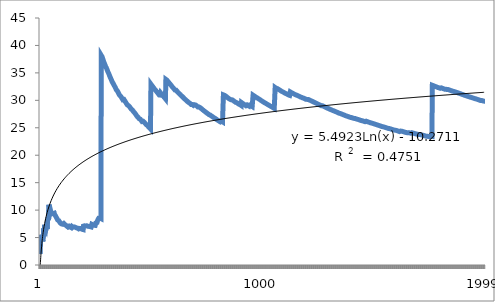
| Category | Series 0 |
|---|---|
| 0 | 2 |
| 1 | 3 |
| 2 | 4.667 |
| 3 | 5.5 |
| 4 | 4.8 |
| 5 | 5.333 |
| 6 | 4.857 |
| 7 | 5.25 |
| 8 | 5.111 |
| 9 | 4.8 |
| 10 | 4.727 |
| 11 | 4.5 |
| 12 | 4.308 |
| 13 | 4.571 |
| 14 | 4.4 |
| 15 | 5.125 |
| 16 | 6.706 |
| 17 | 6.444 |
| 18 | 6.316 |
| 19 | 6.1 |
| 20 | 7.333 |
| 21 | 7.091 |
| 22 | 6.87 |
| 23 | 6.75 |
| 24 | 6.8 |
| 25 | 6.615 |
| 26 | 6.963 |
| 27 | 6.786 |
| 28 | 6.621 |
| 29 | 6.533 |
| 30 | 6.839 |
| 31 | 6.688 |
| 32 | 6.545 |
| 33 | 8.235 |
| 34 | 8.229 |
| 35 | 8.444 |
| 36 | 8.324 |
| 37 | 8.316 |
| 38 | 8.154 |
| 39 | 8.05 |
| 40 | 10.976 |
| 41 | 10.762 |
| 42 | 10.605 |
| 43 | 10.545 |
| 44 | 10.4 |
| 45 | 10.217 |
| 46 | 10.085 |
| 47 | 9.917 |
| 48 | 9.878 |
| 49 | 9.72 |
| 50 | 9.569 |
| 51 | 9.692 |
| 52 | 9.547 |
| 53 | 9.407 |
| 54 | 9.309 |
| 55 | 9.214 |
| 56 | 9.123 |
| 57 | 9.034 |
| 58 | 8.949 |
| 59 | 8.933 |
| 60 | 9.836 |
| 61 | 9.71 |
| 62 | 9.587 |
| 63 | 9.469 |
| 64 | 9.354 |
| 65 | 9.242 |
| 66 | 9.134 |
| 67 | 9.118 |
| 68 | 9.043 |
| 69 | 8.971 |
| 70 | 8.901 |
| 71 | 8.806 |
| 72 | 8.74 |
| 73 | 8.649 |
| 74 | 8.56 |
| 75 | 8.5 |
| 76 | 8.442 |
| 77 | 8.359 |
| 78 | 8.278 |
| 79 | 8.2 |
| 80 | 8.198 |
| 81 | 8.195 |
| 82 | 8.12 |
| 83 | 8.071 |
| 84 | 8.071 |
| 85 | 8 |
| 86 | 7.931 |
| 87 | 7.864 |
| 88 | 7.82 |
| 89 | 7.756 |
| 90 | 7.692 |
| 91 | 7.63 |
| 92 | 7.634 |
| 93 | 7.574 |
| 94 | 7.537 |
| 95 | 7.479 |
| 96 | 7.485 |
| 97 | 7.449 |
| 98 | 7.394 |
| 99 | 7.34 |
| 100 | 7.426 |
| 101 | 7.431 |
| 102 | 7.437 |
| 103 | 7.385 |
| 104 | 7.333 |
| 105 | 7.34 |
| 106 | 7.57 |
| 107 | 7.519 |
| 108 | 7.468 |
| 109 | 7.418 |
| 110 | 7.387 |
| 111 | 7.393 |
| 112 | 7.363 |
| 113 | 7.333 |
| 114 | 7.287 |
| 115 | 7.259 |
| 116 | 7.231 |
| 117 | 7.186 |
| 118 | 7.143 |
| 119 | 7.117 |
| 120 | 7.074 |
| 121 | 7.082 |
| 122 | 7.041 |
| 123 | 7 |
| 124 | 6.96 |
| 125 | 6.921 |
| 126 | 6.898 |
| 127 | 7.094 |
| 128 | 7.101 |
| 129 | 7.062 |
| 130 | 7.069 |
| 131 | 7.03 |
| 132 | 7.038 |
| 133 | 7 |
| 134 | 6.963 |
| 135 | 6.926 |
| 136 | 6.891 |
| 137 | 6.87 |
| 138 | 6.878 |
| 139 | 6.843 |
| 140 | 6.809 |
| 141 | 6.986 |
| 142 | 6.965 |
| 143 | 7.028 |
| 144 | 6.993 |
| 145 | 6.973 |
| 146 | 6.939 |
| 147 | 6.919 |
| 148 | 6.886 |
| 149 | 6.853 |
| 150 | 6.834 |
| 151 | 6.803 |
| 152 | 6.771 |
| 153 | 6.935 |
| 154 | 6.942 |
| 155 | 6.923 |
| 156 | 6.892 |
| 157 | 6.861 |
| 158 | 6.868 |
| 159 | 6.838 |
| 160 | 6.807 |
| 161 | 6.79 |
| 162 | 6.761 |
| 163 | 6.768 |
| 164 | 6.776 |
| 165 | 6.747 |
| 166 | 6.719 |
| 167 | 6.702 |
| 168 | 6.71 |
| 169 | 6.682 |
| 170 | 6.655 |
| 171 | 6.628 |
| 172 | 6.601 |
| 173 | 6.575 |
| 174 | 6.549 |
| 175 | 6.523 |
| 176 | 6.531 |
| 177 | 6.674 |
| 178 | 6.659 |
| 179 | 6.633 |
| 180 | 6.608 |
| 181 | 6.659 |
| 182 | 6.645 |
| 183 | 6.62 |
| 184 | 6.595 |
| 185 | 6.57 |
| 186 | 6.545 |
| 187 | 6.532 |
| 188 | 6.508 |
| 189 | 6.484 |
| 190 | 6.461 |
| 191 | 6.469 |
| 192 | 6.477 |
| 193 | 6.454 |
| 194 | 7.077 |
| 195 | 7.051 |
| 196 | 7.025 |
| 197 | 7.152 |
| 198 | 7.136 |
| 199 | 7.14 |
| 200 | 7.144 |
| 201 | 7.119 |
| 202 | 7.094 |
| 203 | 7.069 |
| 204 | 7.112 |
| 205 | 7.087 |
| 206 | 7.063 |
| 207 | 7.048 |
| 208 | 7.024 |
| 209 | 7.143 |
| 210 | 7.128 |
| 211 | 7.104 |
| 212 | 7.08 |
| 213 | 7.056 |
| 214 | 7.06 |
| 215 | 7.046 |
| 216 | 7.051 |
| 217 | 7.037 |
| 218 | 7.023 |
| 219 | 7.027 |
| 220 | 7.014 |
| 221 | 6.991 |
| 222 | 7.031 |
| 223 | 7.018 |
| 224 | 6.996 |
| 225 | 6.982 |
| 226 | 6.96 |
| 227 | 6.947 |
| 228 | 6.952 |
| 229 | 6.939 |
| 230 | 6.918 |
| 231 | 6.897 |
| 232 | 7.416 |
| 233 | 7.393 |
| 234 | 7.379 |
| 235 | 7.356 |
| 236 | 7.342 |
| 237 | 7.319 |
| 238 | 7.305 |
| 239 | 7.283 |
| 240 | 7.261 |
| 241 | 7.248 |
| 242 | 7.235 |
| 243 | 7.221 |
| 244 | 7.208 |
| 245 | 7.244 |
| 246 | 7.223 |
| 247 | 7.21 |
| 248 | 7.197 |
| 249 | 7.176 |
| 250 | 7.657 |
| 251 | 7.635 |
| 252 | 7.668 |
| 253 | 7.646 |
| 254 | 7.631 |
| 255 | 7.727 |
| 256 | 7.704 |
| 257 | 7.69 |
| 258 | 8.154 |
| 259 | 8.246 |
| 260 | 8.222 |
| 261 | 8.221 |
| 262 | 8.312 |
| 263 | 8.523 |
| 264 | 8.506 |
| 265 | 8.594 |
| 266 | 8.569 |
| 267 | 8.567 |
| 268 | 8.543 |
| 269 | 8.519 |
| 270 | 8.494 |
| 271 | 8.493 |
| 272 | 8.469 |
| 273 | 8.445 |
| 274 | 38.204 |
| 275 | 38.094 |
| 276 | 38.188 |
| 277 | 38.065 |
| 278 | 37.935 |
| 279 | 37.807 |
| 280 | 37.68 |
| 281 | 37.553 |
| 282 | 37.428 |
| 283 | 37.303 |
| 284 | 37.179 |
| 285 | 37.077 |
| 286 | 36.955 |
| 287 | 36.854 |
| 288 | 36.754 |
| 289 | 36.683 |
| 290 | 36.57 |
| 291 | 36.452 |
| 292 | 36.355 |
| 293 | 36.259 |
| 294 | 36.142 |
| 295 | 36.027 |
| 296 | 36.013 |
| 297 | 35.919 |
| 298 | 35.853 |
| 299 | 35.74 |
| 300 | 35.628 |
| 301 | 35.517 |
| 302 | 35.406 |
| 303 | 35.303 |
| 304 | 35.193 |
| 305 | 35.131 |
| 306 | 35.068 |
| 307 | 34.961 |
| 308 | 34.861 |
| 309 | 34.755 |
| 310 | 34.656 |
| 311 | 34.551 |
| 312 | 34.447 |
| 313 | 34.344 |
| 314 | 34.241 |
| 315 | 34.139 |
| 316 | 34.038 |
| 317 | 33.981 |
| 318 | 33.881 |
| 319 | 33.781 |
| 320 | 33.688 |
| 321 | 33.59 |
| 322 | 33.492 |
| 323 | 33.395 |
| 324 | 33.298 |
| 325 | 33.294 |
| 326 | 33.205 |
| 327 | 33.116 |
| 328 | 33.027 |
| 329 | 32.976 |
| 330 | 32.888 |
| 331 | 32.795 |
| 332 | 32.745 |
| 333 | 32.653 |
| 334 | 32.603 |
| 335 | 32.518 |
| 336 | 32.433 |
| 337 | 32.349 |
| 338 | 32.26 |
| 339 | 32.171 |
| 340 | 32.082 |
| 341 | 31.994 |
| 342 | 31.913 |
| 343 | 31.843 |
| 344 | 31.762 |
| 345 | 31.855 |
| 346 | 31.769 |
| 347 | 31.69 |
| 348 | 31.61 |
| 349 | 31.526 |
| 350 | 31.447 |
| 351 | 31.364 |
| 352 | 31.28 |
| 353 | 31.198 |
| 354 | 31.115 |
| 355 | 31.034 |
| 356 | 30.969 |
| 357 | 30.888 |
| 358 | 30.808 |
| 359 | 30.9 |
| 360 | 30.825 |
| 361 | 30.746 |
| 362 | 30.672 |
| 363 | 30.599 |
| 364 | 30.603 |
| 365 | 30.525 |
| 366 | 30.463 |
| 367 | 30.391 |
| 368 | 30.314 |
| 369 | 30.254 |
| 370 | 30.178 |
| 371 | 30.102 |
| 372 | 30.027 |
| 373 | 29.957 |
| 374 | 29.963 |
| 375 | 30.223 |
| 376 | 30.154 |
| 377 | 30.085 |
| 378 | 30.016 |
| 379 | 29.958 |
| 380 | 29.9 |
| 381 | 29.827 |
| 382 | 29.755 |
| 383 | 29.688 |
| 384 | 29.631 |
| 385 | 29.56 |
| 386 | 29.504 |
| 387 | 29.433 |
| 388 | 29.368 |
| 389 | 29.313 |
| 390 | 29.243 |
| 391 | 29.179 |
| 392 | 29.109 |
| 393 | 29.076 |
| 394 | 29.023 |
| 395 | 29.111 |
| 396 | 29.043 |
| 397 | 29.01 |
| 398 | 28.942 |
| 399 | 28.95 |
| 400 | 28.898 |
| 401 | 28.831 |
| 402 | 28.799 |
| 403 | 28.738 |
| 404 | 28.677 |
| 405 | 28.611 |
| 406 | 28.545 |
| 407 | 28.485 |
| 408 | 28.455 |
| 409 | 28.39 |
| 410 | 28.399 |
| 411 | 28.34 |
| 412 | 28.281 |
| 413 | 28.29 |
| 414 | 28.231 |
| 415 | 28.173 |
| 416 | 28.11 |
| 417 | 28.053 |
| 418 | 27.995 |
| 419 | 27.967 |
| 420 | 27.938 |
| 421 | 27.891 |
| 422 | 27.83 |
| 423 | 27.774 |
| 424 | 27.713 |
| 425 | 27.667 |
| 426 | 27.607 |
| 427 | 27.547 |
| 428 | 27.487 |
| 429 | 27.428 |
| 430 | 27.369 |
| 431 | 27.315 |
| 432 | 27.256 |
| 433 | 27.198 |
| 434 | 27.14 |
| 435 | 27.083 |
| 436 | 27.094 |
| 437 | 27.037 |
| 438 | 26.984 |
| 439 | 26.927 |
| 440 | 26.875 |
| 441 | 26.824 |
| 442 | 26.767 |
| 443 | 26.712 |
| 444 | 26.661 |
| 445 | 26.637 |
| 446 | 26.649 |
| 447 | 26.607 |
| 448 | 26.619 |
| 449 | 26.564 |
| 450 | 26.514 |
| 451 | 26.46 |
| 452 | 26.406 |
| 453 | 26.352 |
| 454 | 26.299 |
| 455 | 26.246 |
| 456 | 26.193 |
| 457 | 26.14 |
| 458 | 26.087 |
| 459 | 26.035 |
| 460 | 26.013 |
| 461 | 25.965 |
| 462 | 26.186 |
| 463 | 26.138 |
| 464 | 26.151 |
| 465 | 26.112 |
| 466 | 26.06 |
| 467 | 26.009 |
| 468 | 25.957 |
| 469 | 25.911 |
| 470 | 25.864 |
| 471 | 25.814 |
| 472 | 25.763 |
| 473 | 25.717 |
| 474 | 25.68 |
| 475 | 25.634 |
| 476 | 25.585 |
| 477 | 25.536 |
| 478 | 25.549 |
| 479 | 25.504 |
| 480 | 25.459 |
| 481 | 25.415 |
| 482 | 25.371 |
| 483 | 25.322 |
| 484 | 25.274 |
| 485 | 25.23 |
| 486 | 25.187 |
| 487 | 25.139 |
| 488 | 25.104 |
| 489 | 25.057 |
| 490 | 25.01 |
| 491 | 24.963 |
| 492 | 24.917 |
| 493 | 24.874 |
| 494 | 24.828 |
| 495 | 24.794 |
| 496 | 24.761 |
| 497 | 32.936 |
| 498 | 32.878 |
| 499 | 32.828 |
| 500 | 32.77 |
| 501 | 32.713 |
| 502 | 32.664 |
| 503 | 32.603 |
| 504 | 32.554 |
| 505 | 32.498 |
| 506 | 32.45 |
| 507 | 32.394 |
| 508 | 32.334 |
| 509 | 32.278 |
| 510 | 32.219 |
| 511 | 32.16 |
| 512 | 32.101 |
| 513 | 32.043 |
| 514 | 31.988 |
| 515 | 31.988 |
| 516 | 31.93 |
| 517 | 31.873 |
| 518 | 31.842 |
| 519 | 31.785 |
| 520 | 31.727 |
| 521 | 31.67 |
| 522 | 31.618 |
| 523 | 31.561 |
| 524 | 31.516 |
| 525 | 31.464 |
| 526 | 31.412 |
| 527 | 31.356 |
| 528 | 31.304 |
| 529 | 31.249 |
| 530 | 31.198 |
| 531 | 31.143 |
| 532 | 31.088 |
| 533 | 31.034 |
| 534 | 30.979 |
| 535 | 30.937 |
| 536 | 31.117 |
| 537 | 31.063 |
| 538 | 31.009 |
| 539 | 30.956 |
| 540 | 30.902 |
| 541 | 31.317 |
| 542 | 31.263 |
| 543 | 31.21 |
| 544 | 31.167 |
| 545 | 31.114 |
| 546 | 31.06 |
| 547 | 31.033 |
| 548 | 30.98 |
| 549 | 30.938 |
| 550 | 30.886 |
| 551 | 30.833 |
| 552 | 30.785 |
| 553 | 30.733 |
| 554 | 30.681 |
| 555 | 30.629 |
| 556 | 30.578 |
| 557 | 30.538 |
| 558 | 30.49 |
| 559 | 30.439 |
| 560 | 30.389 |
| 561 | 30.338 |
| 562 | 30.288 |
| 563 | 30.238 |
| 564 | 33.809 |
| 565 | 33.756 |
| 566 | 33.81 |
| 567 | 33.764 |
| 568 | 33.712 |
| 569 | 33.66 |
| 570 | 33.604 |
| 571 | 33.552 |
| 572 | 33.501 |
| 573 | 33.446 |
| 574 | 33.391 |
| 575 | 33.34 |
| 576 | 33.286 |
| 577 | 33.256 |
| 578 | 33.206 |
| 579 | 33.162 |
| 580 | 33.108 |
| 581 | 33.055 |
| 582 | 33.002 |
| 583 | 32.952 |
| 584 | 32.909 |
| 585 | 32.857 |
| 586 | 32.804 |
| 587 | 32.752 |
| 588 | 32.699 |
| 589 | 32.651 |
| 590 | 32.599 |
| 591 | 32.547 |
| 592 | 32.496 |
| 593 | 32.444 |
| 594 | 32.393 |
| 595 | 32.352 |
| 596 | 32.302 |
| 597 | 32.254 |
| 598 | 32.207 |
| 599 | 32.16 |
| 600 | 32.11 |
| 601 | 32.063 |
| 602 | 32.013 |
| 603 | 31.967 |
| 604 | 31.917 |
| 605 | 31.868 |
| 606 | 31.822 |
| 607 | 31.773 |
| 608 | 31.727 |
| 609 | 31.689 |
| 610 | 31.846 |
| 611 | 31.797 |
| 612 | 31.749 |
| 613 | 31.7 |
| 614 | 31.652 |
| 615 | 31.607 |
| 616 | 31.569 |
| 617 | 31.521 |
| 618 | 31.473 |
| 619 | 31.426 |
| 620 | 31.382 |
| 621 | 31.357 |
| 622 | 31.31 |
| 623 | 31.272 |
| 624 | 31.229 |
| 625 | 31.185 |
| 626 | 31.148 |
| 627 | 31.105 |
| 628 | 31.059 |
| 629 | 31.035 |
| 630 | 30.989 |
| 631 | 30.943 |
| 632 | 30.897 |
| 633 | 30.852 |
| 634 | 30.854 |
| 635 | 30.808 |
| 636 | 30.763 |
| 637 | 30.718 |
| 638 | 30.682 |
| 639 | 30.641 |
| 640 | 30.599 |
| 641 | 30.555 |
| 642 | 30.513 |
| 643 | 30.469 |
| 644 | 30.425 |
| 645 | 30.381 |
| 646 | 30.34 |
| 647 | 30.299 |
| 648 | 30.256 |
| 649 | 30.215 |
| 650 | 30.172 |
| 651 | 30.175 |
| 652 | 30.141 |
| 653 | 30.098 |
| 654 | 30.055 |
| 655 | 30.021 |
| 656 | 29.982 |
| 657 | 29.942 |
| 658 | 29.9 |
| 659 | 29.867 |
| 660 | 29.825 |
| 661 | 29.782 |
| 662 | 29.75 |
| 663 | 29.711 |
| 664 | 29.672 |
| 665 | 29.64 |
| 666 | 29.643 |
| 667 | 29.602 |
| 668 | 29.561 |
| 669 | 29.528 |
| 670 | 29.508 |
| 671 | 29.488 |
| 672 | 29.456 |
| 673 | 29.424 |
| 674 | 29.384 |
| 675 | 29.343 |
| 676 | 29.312 |
| 677 | 29.271 |
| 678 | 29.231 |
| 679 | 29.191 |
| 680 | 29.154 |
| 681 | 29.299 |
| 682 | 29.268 |
| 683 | 29.231 |
| 684 | 29.2 |
| 685 | 29.163 |
| 686 | 29.144 |
| 687 | 29.108 |
| 688 | 29.068 |
| 689 | 29.049 |
| 690 | 29.013 |
| 691 | 29.064 |
| 692 | 29.206 |
| 693 | 29.187 |
| 694 | 29.148 |
| 695 | 29.152 |
| 696 | 29.116 |
| 697 | 29.077 |
| 698 | 29.127 |
| 699 | 29.097 |
| 700 | 29.058 |
| 701 | 29.04 |
| 702 | 29.004 |
| 703 | 28.974 |
| 704 | 28.936 |
| 705 | 28.898 |
| 706 | 28.86 |
| 707 | 28.822 |
| 708 | 28.784 |
| 709 | 28.924 |
| 710 | 28.886 |
| 711 | 28.848 |
| 712 | 28.811 |
| 713 | 28.776 |
| 714 | 28.738 |
| 715 | 28.709 |
| 716 | 28.672 |
| 717 | 28.643 |
| 718 | 28.648 |
| 719 | 28.619 |
| 720 | 28.602 |
| 721 | 28.565 |
| 722 | 28.528 |
| 723 | 28.494 |
| 724 | 28.458 |
| 725 | 28.421 |
| 726 | 28.385 |
| 727 | 28.349 |
| 728 | 28.321 |
| 729 | 28.285 |
| 730 | 28.252 |
| 731 | 28.216 |
| 732 | 28.188 |
| 733 | 28.155 |
| 734 | 28.12 |
| 735 | 28.084 |
| 736 | 28.057 |
| 737 | 28.024 |
| 738 | 27.989 |
| 739 | 27.954 |
| 740 | 27.927 |
| 741 | 27.911 |
| 742 | 27.876 |
| 743 | 27.844 |
| 744 | 27.812 |
| 745 | 27.786 |
| 746 | 27.751 |
| 747 | 27.717 |
| 748 | 27.682 |
| 749 | 27.651 |
| 750 | 27.625 |
| 751 | 27.598 |
| 752 | 27.572 |
| 753 | 27.541 |
| 754 | 27.507 |
| 755 | 27.474 |
| 756 | 27.443 |
| 757 | 27.409 |
| 758 | 27.375 |
| 759 | 27.345 |
| 760 | 27.319 |
| 761 | 27.286 |
| 762 | 27.261 |
| 763 | 27.309 |
| 764 | 27.278 |
| 765 | 27.248 |
| 766 | 27.218 |
| 767 | 27.185 |
| 768 | 27.152 |
| 769 | 27.119 |
| 770 | 27.105 |
| 771 | 27.073 |
| 772 | 27.058 |
| 773 | 27.026 |
| 774 | 26.996 |
| 775 | 26.966 |
| 776 | 26.934 |
| 777 | 26.902 |
| 778 | 26.87 |
| 779 | 26.856 |
| 780 | 26.825 |
| 781 | 26.795 |
| 782 | 26.782 |
| 783 | 26.75 |
| 784 | 26.736 |
| 785 | 26.705 |
| 786 | 26.673 |
| 787 | 26.645 |
| 788 | 26.616 |
| 789 | 26.585 |
| 790 | 26.554 |
| 791 | 26.523 |
| 792 | 26.494 |
| 793 | 26.463 |
| 794 | 26.47 |
| 795 | 26.442 |
| 796 | 26.412 |
| 797 | 26.383 |
| 798 | 26.353 |
| 799 | 26.322 |
| 800 | 26.292 |
| 801 | 26.269 |
| 802 | 26.239 |
| 803 | 26.209 |
| 804 | 26.196 |
| 805 | 26.166 |
| 806 | 26.139 |
| 807 | 26.111 |
| 808 | 26.082 |
| 809 | 26.052 |
| 810 | 26.022 |
| 811 | 25.993 |
| 812 | 25.963 |
| 813 | 26.246 |
| 814 | 26.218 |
| 815 | 26.189 |
| 816 | 26.162 |
| 817 | 26.132 |
| 818 | 26.11 |
| 819 | 26.08 |
| 820 | 26.058 |
| 821 | 26.046 |
| 822 | 30.991 |
| 823 | 31.032 |
| 824 | 30.996 |
| 825 | 30.961 |
| 826 | 30.943 |
| 827 | 30.911 |
| 828 | 30.883 |
| 829 | 30.848 |
| 830 | 30.813 |
| 831 | 30.815 |
| 832 | 30.78 |
| 833 | 30.746 |
| 834 | 30.719 |
| 835 | 30.687 |
| 836 | 30.652 |
| 837 | 30.621 |
| 838 | 30.586 |
| 839 | 30.555 |
| 840 | 30.523 |
| 841 | 30.489 |
| 842 | 30.456 |
| 843 | 30.429 |
| 844 | 30.398 |
| 845 | 30.364 |
| 846 | 30.331 |
| 847 | 30.3 |
| 848 | 30.266 |
| 849 | 30.268 |
| 850 | 30.242 |
| 851 | 30.209 |
| 852 | 30.183 |
| 853 | 30.15 |
| 854 | 30.119 |
| 855 | 30.089 |
| 856 | 30.056 |
| 857 | 30.096 |
| 858 | 30.065 |
| 859 | 30.179 |
| 860 | 30.146 |
| 861 | 30.116 |
| 862 | 30.083 |
| 863 | 30.058 |
| 864 | 30.025 |
| 865 | 29.995 |
| 866 | 29.963 |
| 867 | 29.931 |
| 868 | 29.906 |
| 869 | 29.874 |
| 870 | 29.848 |
| 871 | 29.817 |
| 872 | 29.785 |
| 873 | 29.755 |
| 874 | 29.726 |
| 875 | 29.696 |
| 876 | 29.665 |
| 877 | 29.633 |
| 878 | 29.604 |
| 879 | 29.589 |
| 880 | 29.564 |
| 881 | 29.603 |
| 882 | 29.572 |
| 883 | 29.543 |
| 884 | 29.514 |
| 885 | 29.483 |
| 886 | 29.452 |
| 887 | 29.423 |
| 888 | 29.395 |
| 889 | 29.366 |
| 890 | 29.342 |
| 891 | 29.312 |
| 892 | 29.283 |
| 893 | 29.322 |
| 894 | 29.294 |
| 895 | 29.263 |
| 896 | 29.233 |
| 897 | 29.205 |
| 898 | 29.181 |
| 899 | 29.153 |
| 900 | 29.123 |
| 901 | 29.095 |
| 902 | 29.065 |
| 903 | 29.6 |
| 904 | 29.576 |
| 905 | 29.545 |
| 906 | 29.515 |
| 907 | 29.485 |
| 908 | 29.454 |
| 909 | 29.424 |
| 910 | 29.394 |
| 911 | 29.364 |
| 912 | 29.336 |
| 913 | 29.306 |
| 914 | 29.283 |
| 915 | 29.253 |
| 916 | 29.226 |
| 917 | 29.196 |
| 918 | 29.166 |
| 919 | 29.139 |
| 920 | 29.11 |
| 921 | 29.08 |
| 922 | 29.051 |
| 923 | 29.024 |
| 924 | 28.995 |
| 925 | 28.965 |
| 926 | 28.939 |
| 927 | 28.912 |
| 928 | 29.156 |
| 929 | 29.129 |
| 930 | 29.106 |
| 931 | 29.077 |
| 932 | 29.055 |
| 933 | 29.026 |
| 934 | 28.999 |
| 935 | 28.972 |
| 936 | 28.943 |
| 937 | 28.917 |
| 938 | 28.92 |
| 939 | 28.894 |
| 940 | 28.865 |
| 941 | 29.106 |
| 942 | 29.08 |
| 943 | 29.053 |
| 944 | 29.024 |
| 945 | 28.996 |
| 946 | 29.033 |
| 947 | 29.004 |
| 948 | 28.976 |
| 949 | 28.947 |
| 950 | 28.919 |
| 951 | 28.893 |
| 952 | 28.867 |
| 953 | 28.841 |
| 954 | 28.819 |
| 955 | 30.931 |
| 956 | 30.901 |
| 957 | 30.873 |
| 958 | 30.843 |
| 959 | 30.812 |
| 960 | 30.797 |
| 961 | 30.769 |
| 962 | 30.739 |
| 963 | 30.71 |
| 964 | 30.694 |
| 965 | 30.665 |
| 966 | 30.635 |
| 967 | 30.607 |
| 968 | 30.578 |
| 969 | 30.548 |
| 970 | 30.519 |
| 971 | 30.504 |
| 972 | 30.481 |
| 973 | 30.458 |
| 974 | 30.435 |
| 975 | 30.406 |
| 976 | 30.379 |
| 977 | 30.352 |
| 978 | 30.323 |
| 979 | 30.294 |
| 980 | 30.271 |
| 981 | 30.244 |
| 982 | 30.216 |
| 983 | 30.187 |
| 984 | 30.173 |
| 985 | 30.144 |
| 986 | 30.116 |
| 987 | 30.087 |
| 988 | 30.059 |
| 989 | 30.03 |
| 990 | 30.004 |
| 991 | 29.978 |
| 992 | 29.95 |
| 993 | 29.922 |
| 994 | 29.895 |
| 995 | 29.867 |
| 996 | 29.84 |
| 997 | 29.814 |
| 998 | 29.788 |
| 999 | 29.766 |
| 1000 | 29.738 |
| 1001 | 29.711 |
| 1002 | 29.683 |
| 1003 | 29.655 |
| 1004 | 29.628 |
| 1005 | 29.6 |
| 1006 | 29.587 |
| 1007 | 29.562 |
| 1008 | 29.536 |
| 1009 | 29.509 |
| 1010 | 29.496 |
| 1011 | 29.468 |
| 1012 | 29.441 |
| 1013 | 29.416 |
| 1014 | 29.389 |
| 1015 | 29.362 |
| 1016 | 29.335 |
| 1017 | 29.314 |
| 1018 | 29.288 |
| 1019 | 29.275 |
| 1020 | 29.248 |
| 1021 | 29.221 |
| 1022 | 29.195 |
| 1023 | 29.182 |
| 1024 | 29.155 |
| 1025 | 29.129 |
| 1026 | 29.102 |
| 1027 | 29.076 |
| 1028 | 29.05 |
| 1029 | 29.037 |
| 1030 | 29.013 |
| 1031 | 28.986 |
| 1032 | 28.966 |
| 1033 | 28.94 |
| 1034 | 28.914 |
| 1035 | 28.89 |
| 1036 | 28.866 |
| 1037 | 28.84 |
| 1038 | 28.828 |
| 1039 | 28.802 |
| 1040 | 28.782 |
| 1041 | 28.756 |
| 1042 | 28.733 |
| 1043 | 28.707 |
| 1044 | 28.683 |
| 1045 | 28.66 |
| 1046 | 28.634 |
| 1047 | 28.609 |
| 1048 | 28.583 |
| 1049 | 28.558 |
| 1050 | 28.539 |
| 1051 | 28.519 |
| 1052 | 28.5 |
| 1053 | 28.48 |
| 1054 | 32.336 |
| 1055 | 32.307 |
| 1056 | 32.278 |
| 1057 | 32.25 |
| 1058 | 32.223 |
| 1059 | 32.194 |
| 1060 | 32.179 |
| 1061 | 32.151 |
| 1062 | 32.124 |
| 1063 | 32.109 |
| 1064 | 32.139 |
| 1065 | 32.111 |
| 1066 | 32.084 |
| 1067 | 32.056 |
| 1068 | 32.03 |
| 1069 | 32.002 |
| 1070 | 31.987 |
| 1071 | 31.961 |
| 1072 | 31.946 |
| 1073 | 31.918 |
| 1074 | 31.89 |
| 1075 | 31.862 |
| 1076 | 31.835 |
| 1077 | 31.809 |
| 1078 | 31.781 |
| 1079 | 31.754 |
| 1080 | 31.726 |
| 1081 | 31.699 |
| 1082 | 31.671 |
| 1083 | 31.644 |
| 1084 | 31.618 |
| 1085 | 31.597 |
| 1086 | 31.571 |
| 1087 | 31.546 |
| 1088 | 31.546 |
| 1089 | 31.525 |
| 1090 | 31.498 |
| 1091 | 31.476 |
| 1092 | 31.462 |
| 1093 | 31.435 |
| 1094 | 31.408 |
| 1095 | 31.383 |
| 1096 | 31.358 |
| 1097 | 31.333 |
| 1098 | 31.307 |
| 1099 | 31.28 |
| 1100 | 31.253 |
| 1101 | 31.229 |
| 1102 | 31.258 |
| 1103 | 31.232 |
| 1104 | 31.205 |
| 1105 | 31.179 |
| 1106 | 31.158 |
| 1107 | 31.144 |
| 1108 | 31.118 |
| 1109 | 31.092 |
| 1110 | 31.071 |
| 1111 | 31.045 |
| 1112 | 31.019 |
| 1113 | 30.993 |
| 1114 | 30.979 |
| 1115 | 30.953 |
| 1116 | 30.929 |
| 1117 | 30.903 |
| 1118 | 30.879 |
| 1119 | 30.909 |
| 1120 | 31.11 |
| 1121 | 31.089 |
| 1122 | 31.517 |
| 1123 | 31.491 |
| 1124 | 31.465 |
| 1125 | 31.439 |
| 1126 | 31.418 |
| 1127 | 31.392 |
| 1128 | 31.368 |
| 1129 | 31.342 |
| 1130 | 31.342 |
| 1131 | 31.329 |
| 1132 | 31.303 |
| 1133 | 31.277 |
| 1134 | 31.253 |
| 1135 | 31.229 |
| 1136 | 31.205 |
| 1137 | 31.181 |
| 1138 | 31.157 |
| 1139 | 31.132 |
| 1140 | 31.132 |
| 1141 | 31.109 |
| 1142 | 31.083 |
| 1143 | 31.058 |
| 1144 | 31.038 |
| 1145 | 31.024 |
| 1146 | 31.011 |
| 1147 | 30.986 |
| 1148 | 30.963 |
| 1149 | 30.991 |
| 1150 | 30.968 |
| 1151 | 30.944 |
| 1152 | 30.921 |
| 1153 | 30.896 |
| 1154 | 30.873 |
| 1155 | 30.848 |
| 1156 | 30.823 |
| 1157 | 30.824 |
| 1158 | 30.801 |
| 1159 | 30.776 |
| 1160 | 30.751 |
| 1161 | 30.752 |
| 1162 | 30.727 |
| 1163 | 30.704 |
| 1164 | 30.68 |
| 1165 | 30.657 |
| 1166 | 30.632 |
| 1167 | 30.613 |
| 1168 | 30.614 |
| 1169 | 30.615 |
| 1170 | 30.596 |
| 1171 | 30.577 |
| 1172 | 30.554 |
| 1173 | 30.532 |
| 1174 | 30.507 |
| 1175 | 30.483 |
| 1176 | 30.459 |
| 1177 | 30.447 |
| 1178 | 30.427 |
| 1179 | 30.415 |
| 1180 | 30.417 |
| 1181 | 30.404 |
| 1182 | 30.392 |
| 1183 | 30.38 |
| 1184 | 30.358 |
| 1185 | 30.336 |
| 1186 | 30.312 |
| 1187 | 30.29 |
| 1188 | 30.267 |
| 1189 | 30.244 |
| 1190 | 30.225 |
| 1191 | 30.201 |
| 1192 | 30.178 |
| 1193 | 30.206 |
| 1194 | 30.187 |
| 1195 | 30.216 |
| 1196 | 30.192 |
| 1197 | 30.174 |
| 1198 | 30.15 |
| 1199 | 30.127 |
| 1200 | 30.208 |
| 1201 | 30.186 |
| 1202 | 30.165 |
| 1203 | 30.146 |
| 1204 | 30.123 |
| 1205 | 30.1 |
| 1206 | 30.088 |
| 1207 | 30.066 |
| 1208 | 30.068 |
| 1209 | 30.05 |
| 1210 | 30.026 |
| 1211 | 30.005 |
| 1212 | 29.982 |
| 1213 | 29.97 |
| 1214 | 29.949 |
| 1215 | 29.926 |
| 1216 | 29.903 |
| 1217 | 29.88 |
| 1218 | 29.862 |
| 1219 | 29.839 |
| 1220 | 29.818 |
| 1221 | 29.807 |
| 1222 | 29.786 |
| 1223 | 29.765 |
| 1224 | 29.747 |
| 1225 | 29.724 |
| 1226 | 29.702 |
| 1227 | 29.679 |
| 1228 | 29.658 |
| 1229 | 29.637 |
| 1230 | 29.617 |
| 1231 | 29.619 |
| 1232 | 29.596 |
| 1233 | 29.574 |
| 1234 | 29.553 |
| 1235 | 29.532 |
| 1236 | 29.51 |
| 1237 | 29.493 |
| 1238 | 29.472 |
| 1239 | 29.455 |
| 1240 | 29.433 |
| 1241 | 29.411 |
| 1242 | 29.393 |
| 1243 | 29.371 |
| 1244 | 29.354 |
| 1245 | 29.332 |
| 1246 | 29.31 |
| 1247 | 29.29 |
| 1248 | 29.268 |
| 1249 | 29.251 |
| 1250 | 29.229 |
| 1251 | 29.208 |
| 1252 | 29.191 |
| 1253 | 29.171 |
| 1254 | 29.151 |
| 1255 | 29.134 |
| 1256 | 29.123 |
| 1257 | 29.102 |
| 1258 | 29.082 |
| 1259 | 29.06 |
| 1260 | 29.04 |
| 1261 | 29.019 |
| 1262 | 28.998 |
| 1263 | 28.976 |
| 1264 | 28.955 |
| 1265 | 29.033 |
| 1266 | 29.017 |
| 1267 | 28.995 |
| 1268 | 28.974 |
| 1269 | 28.954 |
| 1270 | 28.938 |
| 1271 | 28.917 |
| 1272 | 28.896 |
| 1273 | 28.874 |
| 1274 | 28.853 |
| 1275 | 28.832 |
| 1276 | 28.813 |
| 1277 | 28.797 |
| 1278 | 28.776 |
| 1279 | 28.755 |
| 1280 | 28.734 |
| 1281 | 28.715 |
| 1282 | 28.694 |
| 1283 | 28.673 |
| 1284 | 28.652 |
| 1285 | 28.631 |
| 1286 | 28.611 |
| 1287 | 28.59 |
| 1288 | 28.574 |
| 1289 | 28.553 |
| 1290 | 28.533 |
| 1291 | 28.517 |
| 1292 | 28.52 |
| 1293 | 28.499 |
| 1294 | 28.479 |
| 1295 | 28.458 |
| 1296 | 28.438 |
| 1297 | 28.422 |
| 1298 | 28.402 |
| 1299 | 28.386 |
| 1300 | 28.367 |
| 1301 | 28.347 |
| 1302 | 28.327 |
| 1303 | 28.311 |
| 1304 | 28.302 |
| 1305 | 28.286 |
| 1306 | 28.271 |
| 1307 | 28.252 |
| 1308 | 28.234 |
| 1309 | 28.214 |
| 1310 | 28.194 |
| 1311 | 28.174 |
| 1312 | 28.155 |
| 1313 | 28.135 |
| 1314 | 28.116 |
| 1315 | 28.096 |
| 1316 | 28.099 |
| 1317 | 28.079 |
| 1318 | 28.059 |
| 1319 | 28.041 |
| 1320 | 28.023 |
| 1321 | 28.005 |
| 1322 | 27.995 |
| 1323 | 27.976 |
| 1324 | 27.961 |
| 1325 | 27.952 |
| 1326 | 27.932 |
| 1327 | 27.914 |
| 1328 | 27.896 |
| 1329 | 27.877 |
| 1330 | 27.859 |
| 1331 | 27.839 |
| 1332 | 27.82 |
| 1333 | 27.801 |
| 1334 | 27.781 |
| 1335 | 27.762 |
| 1336 | 27.743 |
| 1337 | 27.723 |
| 1338 | 27.706 |
| 1339 | 27.688 |
| 1340 | 27.673 |
| 1341 | 27.656 |
| 1342 | 27.637 |
| 1343 | 27.618 |
| 1344 | 27.599 |
| 1345 | 27.579 |
| 1346 | 27.562 |
| 1347 | 27.589 |
| 1348 | 27.572 |
| 1349 | 27.554 |
| 1350 | 27.537 |
| 1351 | 27.522 |
| 1352 | 27.503 |
| 1353 | 27.484 |
| 1354 | 27.466 |
| 1355 | 27.457 |
| 1356 | 27.44 |
| 1357 | 27.423 |
| 1358 | 27.408 |
| 1359 | 27.39 |
| 1360 | 27.375 |
| 1361 | 27.361 |
| 1362 | 27.343 |
| 1363 | 27.328 |
| 1364 | 27.31 |
| 1365 | 27.291 |
| 1366 | 27.273 |
| 1367 | 27.254 |
| 1368 | 27.236 |
| 1369 | 27.219 |
| 1370 | 27.201 |
| 1371 | 27.182 |
| 1372 | 27.164 |
| 1373 | 27.15 |
| 1374 | 27.136 |
| 1375 | 27.128 |
| 1376 | 27.114 |
| 1377 | 27.106 |
| 1378 | 27.092 |
| 1379 | 27.074 |
| 1380 | 27.066 |
| 1381 | 27.049 |
| 1382 | 27.031 |
| 1383 | 27.014 |
| 1384 | 27.001 |
| 1385 | 26.983 |
| 1386 | 26.966 |
| 1387 | 26.948 |
| 1388 | 26.932 |
| 1389 | 26.914 |
| 1390 | 26.917 |
| 1391 | 26.901 |
| 1392 | 26.883 |
| 1393 | 26.91 |
| 1394 | 26.892 |
| 1395 | 26.895 |
| 1396 | 26.878 |
| 1397 | 26.86 |
| 1398 | 26.842 |
| 1399 | 26.824 |
| 1400 | 26.808 |
| 1401 | 26.79 |
| 1402 | 26.773 |
| 1403 | 26.776 |
| 1404 | 26.76 |
| 1405 | 26.744 |
| 1406 | 26.728 |
| 1407 | 26.712 |
| 1408 | 26.694 |
| 1409 | 26.698 |
| 1410 | 26.68 |
| 1411 | 26.673 |
| 1412 | 26.699 |
| 1413 | 26.692 |
| 1414 | 26.674 |
| 1415 | 26.661 |
| 1416 | 26.644 |
| 1417 | 26.628 |
| 1418 | 26.61 |
| 1419 | 26.597 |
| 1420 | 26.584 |
| 1421 | 26.567 |
| 1422 | 26.55 |
| 1423 | 26.576 |
| 1424 | 26.559 |
| 1425 | 26.541 |
| 1426 | 26.524 |
| 1427 | 26.507 |
| 1428 | 26.49 |
| 1429 | 26.474 |
| 1430 | 26.461 |
| 1431 | 26.444 |
| 1432 | 26.431 |
| 1433 | 26.414 |
| 1434 | 26.399 |
| 1435 | 26.383 |
| 1436 | 26.366 |
| 1437 | 26.35 |
| 1438 | 26.338 |
| 1439 | 26.322 |
| 1440 | 26.31 |
| 1441 | 26.294 |
| 1442 | 26.298 |
| 1443 | 26.281 |
| 1444 | 26.264 |
| 1445 | 26.248 |
| 1446 | 26.274 |
| 1447 | 26.257 |
| 1448 | 26.24 |
| 1449 | 26.223 |
| 1450 | 26.207 |
| 1451 | 26.194 |
| 1452 | 26.179 |
| 1453 | 26.166 |
| 1454 | 26.15 |
| 1455 | 26.135 |
| 1456 | 26.128 |
| 1457 | 26.111 |
| 1458 | 26.095 |
| 1459 | 26.078 |
| 1460 | 26.235 |
| 1461 | 26.219 |
| 1462 | 26.202 |
| 1463 | 26.19 |
| 1464 | 26.173 |
| 1465 | 26.157 |
| 1466 | 26.142 |
| 1467 | 26.125 |
| 1468 | 26.109 |
| 1469 | 26.094 |
| 1470 | 26.082 |
| 1471 | 26.065 |
| 1472 | 26.05 |
| 1473 | 26.034 |
| 1474 | 26.018 |
| 1475 | 26.005 |
| 1476 | 25.989 |
| 1477 | 25.973 |
| 1478 | 25.966 |
| 1479 | 25.95 |
| 1480 | 25.934 |
| 1481 | 25.919 |
| 1482 | 25.904 |
| 1483 | 25.889 |
| 1484 | 25.875 |
| 1485 | 25.86 |
| 1486 | 25.845 |
| 1487 | 25.849 |
| 1488 | 25.843 |
| 1489 | 25.827 |
| 1490 | 25.812 |
| 1491 | 25.8 |
| 1492 | 25.794 |
| 1493 | 25.778 |
| 1494 | 25.771 |
| 1495 | 25.757 |
| 1496 | 25.742 |
| 1497 | 25.726 |
| 1498 | 25.71 |
| 1499 | 25.695 |
| 1500 | 25.688 |
| 1501 | 25.672 |
| 1502 | 25.657 |
| 1503 | 25.641 |
| 1504 | 25.629 |
| 1505 | 25.618 |
| 1506 | 25.602 |
| 1507 | 25.588 |
| 1508 | 25.573 |
| 1509 | 25.562 |
| 1510 | 25.547 |
| 1511 | 25.532 |
| 1512 | 25.518 |
| 1513 | 25.506 |
| 1514 | 25.494 |
| 1515 | 25.48 |
| 1516 | 25.466 |
| 1517 | 25.452 |
| 1518 | 25.438 |
| 1519 | 25.424 |
| 1520 | 25.408 |
| 1521 | 25.393 |
| 1522 | 25.378 |
| 1523 | 25.362 |
| 1524 | 25.347 |
| 1525 | 25.333 |
| 1526 | 25.319 |
| 1527 | 25.313 |
| 1528 | 25.298 |
| 1529 | 25.284 |
| 1530 | 25.268 |
| 1531 | 25.253 |
| 1532 | 25.239 |
| 1533 | 25.228 |
| 1534 | 25.214 |
| 1535 | 25.203 |
| 1536 | 25.189 |
| 1537 | 25.194 |
| 1538 | 25.183 |
| 1539 | 25.171 |
| 1540 | 25.158 |
| 1541 | 25.162 |
| 1542 | 25.148 |
| 1543 | 25.135 |
| 1544 | 25.12 |
| 1545 | 25.105 |
| 1546 | 25.09 |
| 1547 | 25.076 |
| 1548 | 25.063 |
| 1549 | 25.048 |
| 1550 | 25.033 |
| 1551 | 25.018 |
| 1552 | 25.007 |
| 1553 | 24.992 |
| 1554 | 24.981 |
| 1555 | 24.967 |
| 1556 | 24.952 |
| 1557 | 24.937 |
| 1558 | 24.922 |
| 1559 | 24.909 |
| 1560 | 24.894 |
| 1561 | 24.881 |
| 1562 | 24.866 |
| 1563 | 24.891 |
| 1564 | 24.896 |
| 1565 | 24.881 |
| 1566 | 24.867 |
| 1567 | 24.852 |
| 1568 | 24.837 |
| 1569 | 24.823 |
| 1570 | 24.808 |
| 1571 | 24.803 |
| 1572 | 24.788 |
| 1573 | 24.774 |
| 1574 | 24.761 |
| 1575 | 24.747 |
| 1576 | 24.733 |
| 1577 | 24.719 |
| 1578 | 24.704 |
| 1579 | 24.691 |
| 1580 | 24.678 |
| 1581 | 24.668 |
| 1582 | 24.653 |
| 1583 | 24.639 |
| 1584 | 24.625 |
| 1585 | 24.612 |
| 1586 | 24.599 |
| 1587 | 24.584 |
| 1588 | 24.571 |
| 1589 | 24.596 |
| 1590 | 24.591 |
| 1591 | 24.578 |
| 1592 | 24.564 |
| 1593 | 24.568 |
| 1594 | 24.555 |
| 1595 | 24.541 |
| 1596 | 24.527 |
| 1597 | 24.514 |
| 1598 | 24.5 |
| 1599 | 24.488 |
| 1600 | 24.473 |
| 1601 | 24.459 |
| 1602 | 24.447 |
| 1603 | 24.434 |
| 1604 | 24.42 |
| 1605 | 24.406 |
| 1606 | 24.392 |
| 1607 | 24.378 |
| 1608 | 24.364 |
| 1609 | 24.35 |
| 1610 | 24.336 |
| 1611 | 24.323 |
| 1612 | 24.31 |
| 1613 | 24.296 |
| 1614 | 24.282 |
| 1615 | 24.426 |
| 1616 | 24.412 |
| 1617 | 24.399 |
| 1618 | 24.424 |
| 1619 | 24.411 |
| 1620 | 24.399 |
| 1621 | 24.385 |
| 1622 | 24.371 |
| 1623 | 24.358 |
| 1624 | 24.346 |
| 1625 | 24.332 |
| 1626 | 24.327 |
| 1627 | 24.313 |
| 1628 | 24.3 |
| 1629 | 24.286 |
| 1630 | 24.273 |
| 1631 | 24.26 |
| 1632 | 24.246 |
| 1633 | 24.234 |
| 1634 | 24.22 |
| 1635 | 24.208 |
| 1636 | 24.195 |
| 1637 | 24.182 |
| 1638 | 24.168 |
| 1639 | 24.156 |
| 1640 | 24.143 |
| 1641 | 24.147 |
| 1642 | 24.134 |
| 1643 | 24.129 |
| 1644 | 24.117 |
| 1645 | 24.112 |
| 1646 | 24.107 |
| 1647 | 24.095 |
| 1648 | 24.082 |
| 1649 | 24.145 |
| 1650 | 24.132 |
| 1651 | 24.119 |
| 1652 | 24.114 |
| 1653 | 24.104 |
| 1654 | 24.109 |
| 1655 | 24.095 |
| 1656 | 24.083 |
| 1657 | 24.071 |
| 1658 | 24.059 |
| 1659 | 24.046 |
| 1660 | 24.036 |
| 1661 | 24.026 |
| 1662 | 24.014 |
| 1663 | 24.001 |
| 1664 | 23.988 |
| 1665 | 23.975 |
| 1666 | 24.114 |
| 1667 | 24.101 |
| 1668 | 24.087 |
| 1669 | 24.074 |
| 1670 | 24.062 |
| 1671 | 24.049 |
| 1672 | 24.039 |
| 1673 | 24.026 |
| 1674 | 24.013 |
| 1675 | 24.001 |
| 1676 | 23.992 |
| 1677 | 23.98 |
| 1678 | 23.97 |
| 1679 | 23.957 |
| 1680 | 23.944 |
| 1681 | 23.932 |
| 1682 | 23.919 |
| 1683 | 23.906 |
| 1684 | 23.893 |
| 1685 | 23.881 |
| 1686 | 23.868 |
| 1687 | 23.864 |
| 1688 | 23.851 |
| 1689 | 23.839 |
| 1690 | 23.844 |
| 1691 | 23.832 |
| 1692 | 23.828 |
| 1693 | 23.815 |
| 1694 | 23.803 |
| 1695 | 23.79 |
| 1696 | 23.778 |
| 1697 | 23.766 |
| 1698 | 23.756 |
| 1699 | 23.818 |
| 1700 | 23.805 |
| 1701 | 23.796 |
| 1702 | 23.786 |
| 1703 | 23.777 |
| 1704 | 23.764 |
| 1705 | 23.751 |
| 1706 | 23.742 |
| 1707 | 23.73 |
| 1708 | 23.717 |
| 1709 | 23.704 |
| 1710 | 23.693 |
| 1711 | 23.688 |
| 1712 | 23.675 |
| 1713 | 23.666 |
| 1714 | 23.654 |
| 1715 | 23.642 |
| 1716 | 23.63 |
| 1717 | 23.634 |
| 1718 | 23.622 |
| 1719 | 23.609 |
| 1720 | 23.605 |
| 1721 | 23.592 |
| 1722 | 23.58 |
| 1723 | 23.567 |
| 1724 | 23.555 |
| 1725 | 23.543 |
| 1726 | 23.531 |
| 1727 | 23.519 |
| 1728 | 23.506 |
| 1729 | 23.495 |
| 1730 | 23.482 |
| 1731 | 23.471 |
| 1732 | 23.46 |
| 1733 | 23.448 |
| 1734 | 23.435 |
| 1735 | 23.459 |
| 1736 | 23.446 |
| 1737 | 23.451 |
| 1738 | 23.439 |
| 1739 | 23.426 |
| 1740 | 23.415 |
| 1741 | 23.411 |
| 1742 | 23.4 |
| 1743 | 23.396 |
| 1744 | 23.383 |
| 1745 | 23.388 |
| 1746 | 23.377 |
| 1747 | 23.373 |
| 1748 | 23.364 |
| 1749 | 23.352 |
| 1750 | 23.348 |
| 1751 | 23.481 |
| 1752 | 23.504 |
| 1753 | 23.493 |
| 1754 | 23.484 |
| 1755 | 23.472 |
| 1756 | 23.467 |
| 1757 | 23.456 |
| 1758 | 23.444 |
| 1759 | 32.74 |
| 1760 | 32.723 |
| 1761 | 32.714 |
| 1762 | 32.697 |
| 1763 | 32.68 |
| 1764 | 32.663 |
| 1765 | 32.646 |
| 1766 | 32.628 |
| 1767 | 32.611 |
| 1768 | 32.594 |
| 1769 | 32.576 |
| 1770 | 32.56 |
| 1771 | 32.544 |
| 1772 | 32.527 |
| 1773 | 32.51 |
| 1774 | 32.492 |
| 1775 | 32.479 |
| 1776 | 32.469 |
| 1777 | 32.452 |
| 1778 | 32.436 |
| 1779 | 32.419 |
| 1780 | 32.402 |
| 1781 | 32.385 |
| 1782 | 32.369 |
| 1783 | 32.352 |
| 1784 | 32.335 |
| 1785 | 32.321 |
| 1786 | 32.304 |
| 1787 | 32.304 |
| 1788 | 32.287 |
| 1789 | 32.272 |
| 1790 | 32.255 |
| 1791 | 32.246 |
| 1792 | 32.23 |
| 1793 | 32.214 |
| 1794 | 32.197 |
| 1795 | 32.18 |
| 1796 | 32.171 |
| 1797 | 32.162 |
| 1798 | 32.146 |
| 1799 | 32.27 |
| 1800 | 32.253 |
| 1801 | 32.238 |
| 1802 | 32.221 |
| 1803 | 32.204 |
| 1804 | 32.187 |
| 1805 | 32.171 |
| 1806 | 32.155 |
| 1807 | 32.146 |
| 1808 | 32.129 |
| 1809 | 32.113 |
| 1810 | 32.096 |
| 1811 | 32.079 |
| 1812 | 32.064 |
| 1813 | 32.051 |
| 1814 | 32.037 |
| 1815 | 32.021 |
| 1816 | 32.012 |
| 1817 | 32.065 |
| 1818 | 32.049 |
| 1819 | 32.036 |
| 1820 | 32.02 |
| 1821 | 32.003 |
| 1822 | 31.99 |
| 1823 | 31.977 |
| 1824 | 31.962 |
| 1825 | 31.962 |
| 1826 | 31.945 |
| 1827 | 31.937 |
| 1828 | 31.923 |
| 1829 | 31.976 |
| 1830 | 31.96 |
| 1831 | 31.943 |
| 1832 | 31.93 |
| 1833 | 31.917 |
| 1834 | 31.904 |
| 1835 | 31.888 |
| 1836 | 31.875 |
| 1837 | 31.859 |
| 1838 | 31.843 |
| 1839 | 31.828 |
| 1840 | 31.812 |
| 1841 | 31.799 |
| 1842 | 31.784 |
| 1843 | 31.768 |
| 1844 | 31.752 |
| 1845 | 31.736 |
| 1846 | 31.721 |
| 1847 | 31.705 |
| 1848 | 31.69 |
| 1849 | 31.677 |
| 1850 | 31.661 |
| 1851 | 31.678 |
| 1852 | 31.662 |
| 1853 | 31.647 |
| 1854 | 31.631 |
| 1855 | 31.616 |
| 1856 | 31.602 |
| 1857 | 31.589 |
| 1858 | 31.573 |
| 1859 | 31.573 |
| 1860 | 31.557 |
| 1861 | 31.541 |
| 1862 | 31.529 |
| 1863 | 31.513 |
| 1864 | 31.498 |
| 1865 | 31.482 |
| 1866 | 31.468 |
| 1867 | 31.468 |
| 1868 | 31.455 |
| 1869 | 31.44 |
| 1870 | 31.424 |
| 1871 | 31.409 |
| 1872 | 31.395 |
| 1873 | 31.379 |
| 1874 | 31.363 |
| 1875 | 31.348 |
| 1876 | 31.332 |
| 1877 | 31.316 |
| 1878 | 31.301 |
| 1879 | 31.285 |
| 1880 | 31.271 |
| 1881 | 31.255 |
| 1882 | 31.241 |
| 1883 | 31.226 |
| 1884 | 31.211 |
| 1885 | 31.195 |
| 1886 | 31.183 |
| 1887 | 31.167 |
| 1888 | 31.152 |
| 1889 | 31.14 |
| 1890 | 31.125 |
| 1891 | 31.11 |
| 1892 | 31.095 |
| 1893 | 31.079 |
| 1894 | 31.064 |
| 1895 | 31.049 |
| 1896 | 31.034 |
| 1897 | 31.02 |
| 1898 | 31.005 |
| 1899 | 30.989 |
| 1900 | 30.974 |
| 1901 | 30.959 |
| 1902 | 30.944 |
| 1903 | 30.93 |
| 1904 | 30.914 |
| 1905 | 30.902 |
| 1906 | 30.89 |
| 1907 | 30.875 |
| 1908 | 30.861 |
| 1909 | 30.847 |
| 1910 | 30.835 |
| 1911 | 30.82 |
| 1912 | 30.805 |
| 1913 | 30.79 |
| 1914 | 30.775 |
| 1915 | 30.76 |
| 1916 | 30.748 |
| 1917 | 30.733 |
| 1918 | 30.719 |
| 1919 | 30.704 |
| 1920 | 30.705 |
| 1921 | 30.69 |
| 1922 | 30.676 |
| 1923 | 30.661 |
| 1924 | 30.646 |
| 1925 | 30.631 |
| 1926 | 30.62 |
| 1927 | 30.612 |
| 1928 | 30.597 |
| 1929 | 30.583 |
| 1930 | 30.572 |
| 1931 | 30.56 |
| 1932 | 30.546 |
| 1933 | 30.532 |
| 1934 | 30.518 |
| 1935 | 30.51 |
| 1936 | 30.496 |
| 1937 | 30.482 |
| 1938 | 30.474 |
| 1939 | 30.46 |
| 1940 | 30.445 |
| 1941 | 30.43 |
| 1942 | 30.416 |
| 1943 | 30.401 |
| 1944 | 30.388 |
| 1945 | 30.374 |
| 1946 | 30.36 |
| 1947 | 30.345 |
| 1948 | 30.331 |
| 1949 | 30.317 |
| 1950 | 30.31 |
| 1951 | 30.302 |
| 1952 | 30.295 |
| 1953 | 30.28 |
| 1954 | 30.266 |
| 1955 | 30.253 |
| 1956 | 30.238 |
| 1957 | 30.224 |
| 1958 | 30.212 |
| 1959 | 30.198 |
| 1960 | 30.184 |
| 1961 | 30.169 |
| 1962 | 30.155 |
| 1963 | 30.141 |
| 1964 | 30.126 |
| 1965 | 30.113 |
| 1966 | 30.099 |
| 1967 | 30.084 |
| 1968 | 30.07 |
| 1969 | 30.057 |
| 1970 | 30.044 |
| 1971 | 30.03 |
| 1972 | 30.016 |
| 1973 | 30.002 |
| 1974 | 29.988 |
| 1975 | 29.974 |
| 1976 | 29.96 |
| 1977 | 29.945 |
| 1978 | 29.995 |
| 1979 | 29.981 |
| 1980 | 29.967 |
| 1981 | 29.953 |
| 1982 | 29.946 |
| 1983 | 29.931 |
| 1984 | 29.917 |
| 1985 | 29.904 |
| 1986 | 29.893 |
| 1987 | 29.88 |
| 1988 | 29.867 |
| 1989 | 29.856 |
| 1990 | 29.906 |
| 1991 | 29.892 |
| 1992 | 29.878 |
| 1993 | 29.864 |
| 1994 | 29.85 |
| 1995 | 29.836 |
| 1996 | 29.829 |
| 1997 | 29.815 |
| 1998 | 29.802 |
| 1999 | 29.795 |